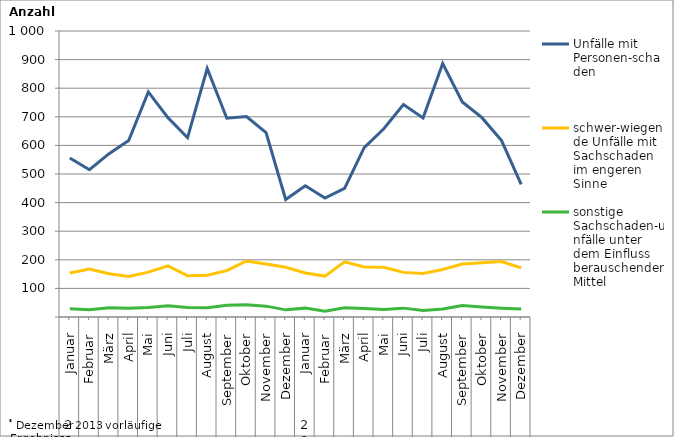
| Category | Unfälle mit Personen-schaden | schwer-wiegende Unfälle mit Sachschaden   im engeren Sinne | sonstige Sachschaden-unfälle unter dem Einfluss berauschender Mittel |
|---|---|---|---|
| 0 | 556 | 154 | 29 |
| 1 | 515 | 168 | 25 |
| 2 | 571 | 151 | 32 |
| 3 | 617 | 142 | 31 |
| 4 | 787 | 157 | 33 |
| 5 | 697 | 179 | 39 |
| 6 | 627 | 144 | 33 |
| 7 | 869 | 146 | 32 |
| 8 | 695 | 162 | 41 |
| 9 | 701 | 196 | 43 |
| 10 | 645 | 185 | 38 |
| 11 | 411 | 174 | 25 |
| 12 | 459 | 154 | 31 |
| 13 | 416 | 143 | 20 |
| 14 | 450 | 193 | 32 |
| 15 | 592 | 175 | 30 |
| 16 | 658 | 174 | 26 |
| 17 | 743 | 156 | 31 |
| 18 | 696 | 152 | 23 |
| 19 | 886 | 166 | 28 |
| 20 | 752 | 185 | 40 |
| 21 | 697 | 190 | 35 |
| 22 | 617 | 194 | 31 |
| 23 | 464 | 172 | 28 |